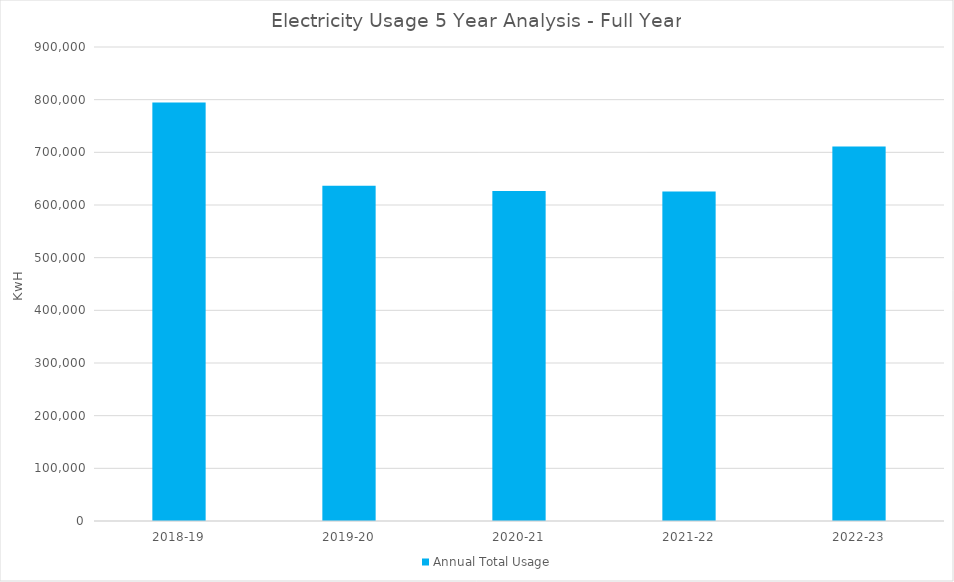
| Category | Annual Total Usage |
|---|---|
| 2018-19 | 794558 |
| 2019-20 | 636518 |
| 2020-21 | 626393 |
| 2021-22 | 625841 |
| 2022-23 | 711152 |